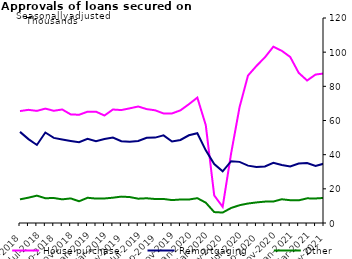
| Category | House purchase | Remortgaging | Other |
|---|---|---|---|
| May-2018 | 65527 | 53337 | 13837 |
| Jun-2018 | 66242 | 49102 | 14825 |
| Jul-2018 | 65623 | 45678 | 16022 |
| Aug-2018 | 66960 | 52970 | 14506 |
| Sep-2018 | 65691 | 49818 | 14630 |
| Oct-2018 | 66451 | 48882 | 13843 |
| Nov-2018 | 63581 | 48030 | 14391 |
| Dec-2018 | 63357 | 47251 | 12728 |
| Jan-2019 | 65156 | 49317 | 14771 |
| Feb-2019 | 65165 | 47907 | 14292 |
| Mar-2019 | 62912 | 49169 | 14362 |
| Apr-2019 | 66432 | 50024 | 14808 |
| May-2019 | 66110 | 47877 | 15446 |
| Jun-2019 | 67126 | 47606 | 15178 |
| Jul-2019 | 68192 | 48001 | 14233 |
| Aug-2019 | 66665 | 49876 | 14477 |
| Sep-2019 | 65969 | 49992 | 14043 |
| Oct-2019 | 64128 | 51291 | 14063 |
| Nov-2019 | 64137 | 47671 | 13405 |
| Dec-2019 | 65940 | 48587 | 13750 |
| Jan-2020 | 69534 | 51348 | 13740 |
| Feb-2020 | 73396 | 52561 | 14538 |
| Mar-2020 | 57280 | 42525 | 11901 |
| Apr-2020 | 16125 | 34485 | 6387 |
| May-2020 | 9444 | 30225 | 6121 |
| Jun-2020 | 40717 | 36173 | 8788 |
| Jul-2020 | 67823 | 35784 | 10411 |
| Aug-2020 | 86317 | 33572 | 11407 |
| Sep-2020 | 91930 | 32787 | 12044 |
| Oct-2020 | 96941 | 33135 | 12512 |
| Nov-2020 | 103199 | 35189 | 12568 |
| Dec-2020 | 100791 | 33932 | 13895 |
| Jan-2021 | 97192 | 33036 | 13340 |
| Feb-2021 | 87912 | 34827 | 13259 |
| Mar-2021 | 83414 | 35071 | 14429 |
| Apr-2021 | 86897 | 33360 | 14363 |
| May-2021 | 87545 | 34758 | 14685 |